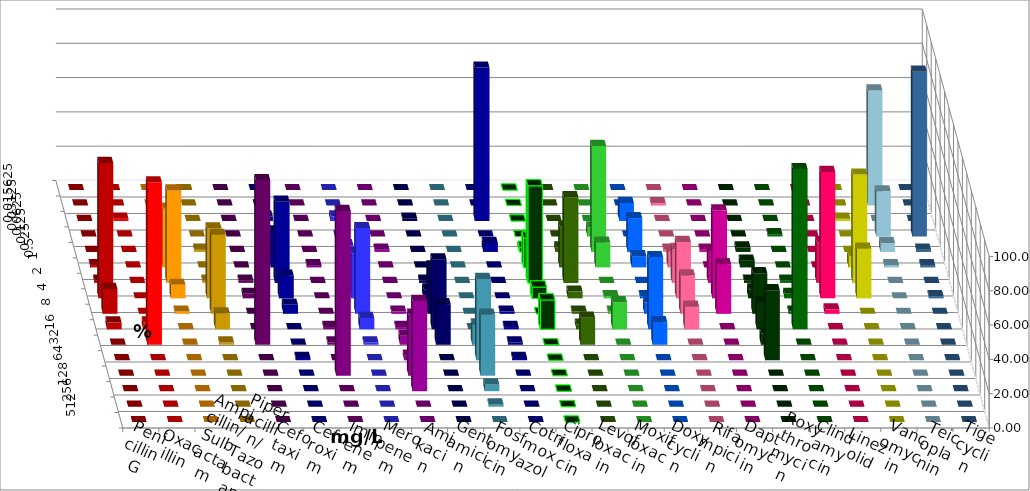
| Category | Penicillin G | Oxacillin | Ampicillin/ Sulbactam | Piperacillin/ Tazobactam | Cefotaxim | Cefuroxim | Imipenem | Meropenem | Amikacin | Gentamicin | Fosfomycin | Cotrimoxazol | Ciprofloxacin | Levofloxacin | Moxifloxacin | Doxycyclin | Rifampicin | Daptomycin | Roxythromycin | Clindamycin | Linezolid | Vancomycin | Teicoplanin | Tigecyclin |
|---|---|---|---|---|---|---|---|---|---|---|---|---|---|---|---|---|---|---|---|---|---|---|---|---|
| 0.015625 | 0 | 0 | 0 | 0 | 0 | 0 | 0 | 0 | 0 | 0 | 0 | 0 | 0 | 0 | 0 | 0 | 0 | 0 | 0 | 0 | 0 | 0 | 0 | 0 |
| 0.03125 | 0 | 0 | 0 | 0 | 0 | 0 | 0 | 0 | 0 | 0 | 0 | 0 | 0 | 0 | 0 | 0 | 1.316 | 0 | 0 | 0 | 0 | 0 | 0 | 67.105 |
| 0.0625 | 0 | 1.316 | 0 | 0 | 0 | 0 | 2.632 | 2.632 | 0 | 1.316 | 0 | 89.474 | 0 | 0 | 0 | 10.526 | 0 | 0 | 0 | 0 | 0 | 1.316 | 0 | 0 |
| 0.125 | 0 | 0 | 2.632 | 0 | 0 | 0 | 0 | 0 | 0 | 0 | 0 | 0 | 0 | 0 | 5.263 | 0 | 0 | 0 | 0 | 1.316 | 0 | 0 | 96.053 | 26.316 |
| 0.25 | 0 | 0 | 0 | 1.316 | 0 | 0 | 9.211 | 3.947 | 1.316 | 0 | 0 | 5.263 | 2.632 | 2.632 | 61.842 | 19.737 | 1.316 | 1.316 | 2.632 | 0 | 0 | 0 | 1.316 | 5.263 |
| 0.5 | 1.316 | 0 | 34.211 | 0 | 0 | 1.316 | 21.053 | 3.947 | 0 | 0 | 0 | 0 | 17.105 | 23.684 | 14.474 | 6.579 | 9.211 | 0 | 3.947 | 0 | 0 | 6.579 | 1.316 | 1.316 |
| 1.0 | 1.316 | 0 | 53.947 | 1.316 | 1.316 | 0 | 47.368 | 5.263 | 0 | 1.316 | 0 | 0 | 56.579 | 50 | 0 | 0 | 19.737 | 18.421 | 1.316 | 1.316 | 23.684 | 63.158 | 0 | 0 |
| 2.0 | 78.947 | 0 | 7.895 | 40.789 | 2.632 | 0 | 13.158 | 26.316 | 0 | 5.263 | 0 | 0 | 6.579 | 3.947 | 1.316 | 1.316 | 32.895 | 51.316 | 5.263 | 2.632 | 73.684 | 28.947 | 1.316 | 0 |
| 4.0 | 14.474 | 0 | 1.316 | 46.053 | 0 | 0 | 5.263 | 50 | 1.316 | 27.632 | 0 | 1.316 | 0 | 1.316 | 1.316 | 6.579 | 22.368 | 28.947 | 23.684 | 1.316 | 2.632 | 0 | 0 | 0 |
| 8.0 | 3.947 | 3.947 | 0 | 9.211 | 0 | 1.316 | 0 | 6.579 | 1.316 | 40.789 | 0 | 1.316 | 17.105 | 2.632 | 15.789 | 42.105 | 13.158 | 0 | 15.789 | 93.421 | 0 | 0 | 0 | 0 |
| 16.0 | 0 | 94.737 | 0 | 1.316 | 96.053 | 1.316 | 0 | 1.316 | 5.263 | 23.684 | 11.842 | 1.316 | 0 | 15.789 | 0 | 13.158 | 0 | 0 | 6.579 | 0 | 0 | 0 | 0 | 0 |
| 32.0 | 0 | 0 | 0 | 0 | 0 | 0 | 1.316 | 0 | 2.632 | 0 | 47.368 | 1.316 | 0 | 0 | 0 | 0 | 0 | 0 | 40.789 | 0 | 0 | 0 | 0 | 0 |
| 64.0 | 0 | 0 | 0 | 0 | 0 | 96.053 | 0 | 0 | 35.526 | 0 | 35.526 | 0 | 0 | 0 | 0 | 0 | 0 | 0 | 0 | 0 | 0 | 0 | 0 | 0 |
| 128.0 | 0 | 0 | 0 | 0 | 0 | 0 | 0 | 0 | 52.632 | 0 | 3.947 | 0 | 0 | 0 | 0 | 0 | 0 | 0 | 0 | 0 | 0 | 0 | 0 | 0 |
| 256.0 | 0 | 0 | 0 | 0 | 0 | 0 | 0 | 0 | 0 | 0 | 1.316 | 0 | 0 | 0 | 0 | 0 | 0 | 0 | 0 | 0 | 0 | 0 | 0 | 0 |
| 512.0 | 0 | 0 | 0 | 0 | 0 | 0 | 0 | 0 | 0 | 0 | 0 | 0 | 0 | 0 | 0 | 0 | 0 | 0 | 0 | 0 | 0 | 0 | 0 | 0 |